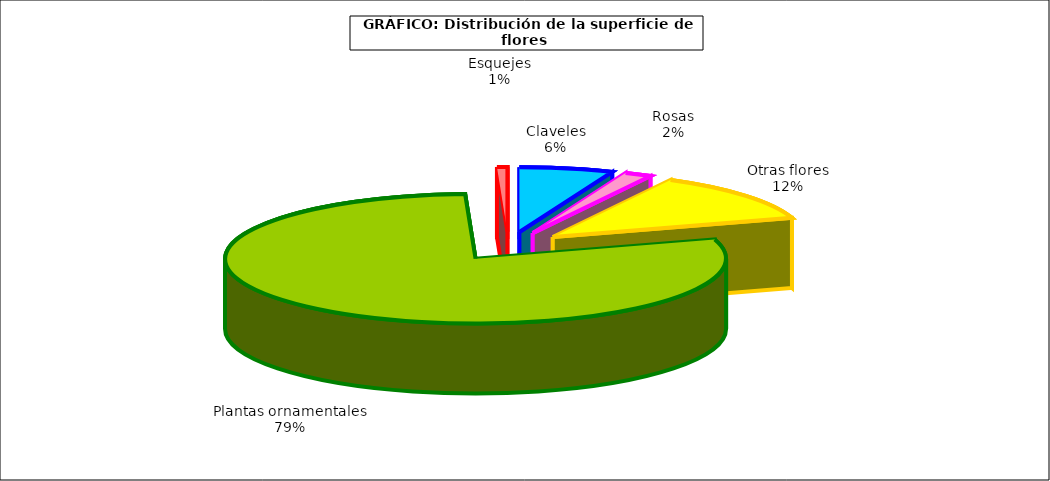
| Category | Series 0 |
|---|---|
| 0 | 37654 |
| 1 | 10892 |
| 2 | 77310 |
| 3 | 493515 |
| 4 | 4130 |